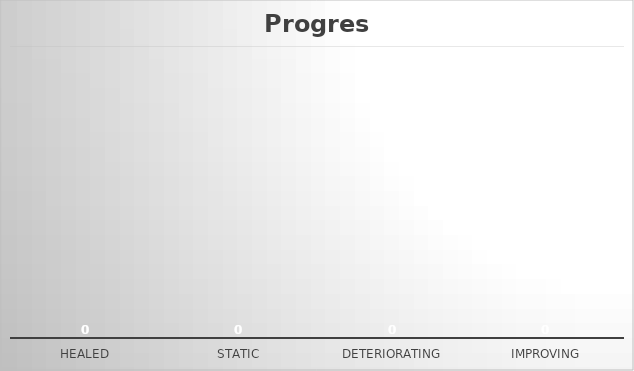
| Category | Series 0 |
|---|---|
| Healed | 0 |
| Static | 0 |
| Deteriorating | 0 |
| Improving | 0 |